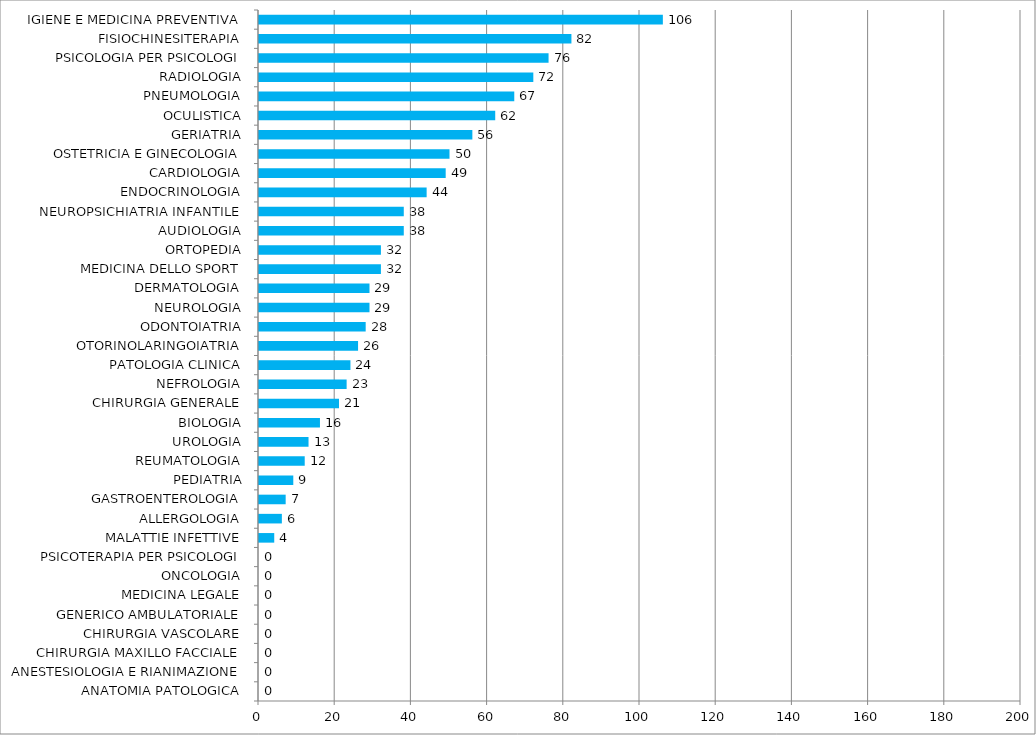
| Category | Series 0 |
|---|---|
| ANATOMIA PATOLOGICA | 0 |
| ANESTESIOLOGIA E RIANIMAZIONE | 0 |
| CHIRURGIA MAXILLO FACCIALE | 0 |
| CHIRURGIA VASCOLARE | 0 |
| GENERICO AMBULATORIALE | 0 |
| MEDICINA LEGALE | 0 |
| ONCOLOGIA | 0 |
| PSICOTERAPIA PER PSICOLOGI | 0 |
| MALATTIE INFETTIVE | 4 |
| ALLERGOLOGIA | 6 |
| GASTROENTEROLOGIA | 7 |
| PEDIATRIA | 9 |
| REUMATOLOGIA | 12 |
| UROLOGIA | 13 |
| BIOLOGIA | 16 |
| CHIRURGIA GENERALE | 21 |
| NEFROLOGIA | 23 |
| PATOLOGIA CLINICA | 24 |
| OTORINOLARINGOIATRIA | 26 |
| ODONTOIATRIA | 28 |
| NEUROLOGIA | 29 |
| DERMATOLOGIA | 29 |
| MEDICINA DELLO SPORT | 32 |
| ORTOPEDIA | 32 |
| AUDIOLOGIA | 38 |
| NEUROPSICHIATRIA INFANTILE | 38 |
| ENDOCRINOLOGIA | 44 |
| CARDIOLOGIA | 49 |
| OSTETRICIA E GINECOLOGIA | 50 |
| GERIATRIA | 56 |
| OCULISTICA | 62 |
| PNEUMOLOGIA | 67 |
| RADIOLOGIA | 72 |
| PSICOLOGIA PER PSICOLOGI | 76 |
| FISIOCHINESITERAPIA | 82 |
| IGIENE E MEDICINA PREVENTIVA | 106 |